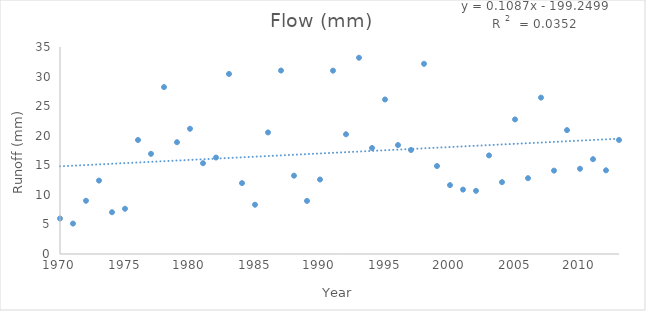
| Category | Flow (mm) |
|---|---|
| 1970.0 | 6.003 |
| 1971.0 | 5.142 |
| 1972.0 | 9.001 |
| 1973.0 | 12.415 |
| 1974.0 | 7.066 |
| 1975.0 | 7.65 |
| 1976.0 | 19.272 |
| 1977.0 | 16.935 |
| 1978.0 | 28.222 |
| 1979.0 | 18.901 |
| 1980.0 | 21.175 |
| 1981.0 | 15.351 |
| 1982.0 | 16.309 |
| 1983.0 | 30.444 |
| 1984.0 | 11.986 |
| 1985.0 | 8.332 |
| 1986.0 | 20.553 |
| 1987.0 | 31.021 |
| 1988.0 | 13.241 |
| 1989.0 | 8.974 |
| 1990.0 | 12.595 |
| 1991.0 | 31 |
| 1992.0 | 20.247 |
| 1993.0 | 33.184 |
| 1994.0 | 17.923 |
| 1995.0 | 26.126 |
| 1996.0 | 18.418 |
| 1997.0 | 17.587 |
| 1998.0 | 32.157 |
| 1999.0 | 14.875 |
| 2000.0 | 11.648 |
| 2001.0 | 10.889 |
| 2002.0 | 10.68 |
| 2003.0 | 16.668 |
| 2004.0 | 12.151 |
| 2005.0 | 22.752 |
| 2006.0 | 12.818 |
| 2007.0 | 26.443 |
| 2008.0 | 14.095 |
| 2009.0 | 20.948 |
| 2010.0 | 14.413 |
| 2011.0 | 16.031 |
| 2012.0 | 14.149 |
| 2013.0 | 19.281 |